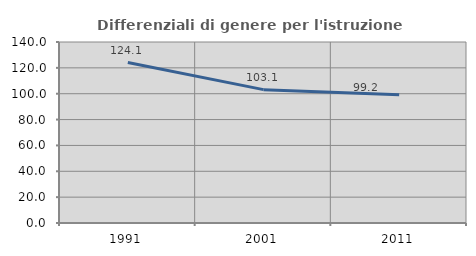
| Category | Differenziali di genere per l'istruzione superiore |
|---|---|
| 1991.0 | 124.104 |
| 2001.0 | 103.141 |
| 2011.0 | 99.194 |